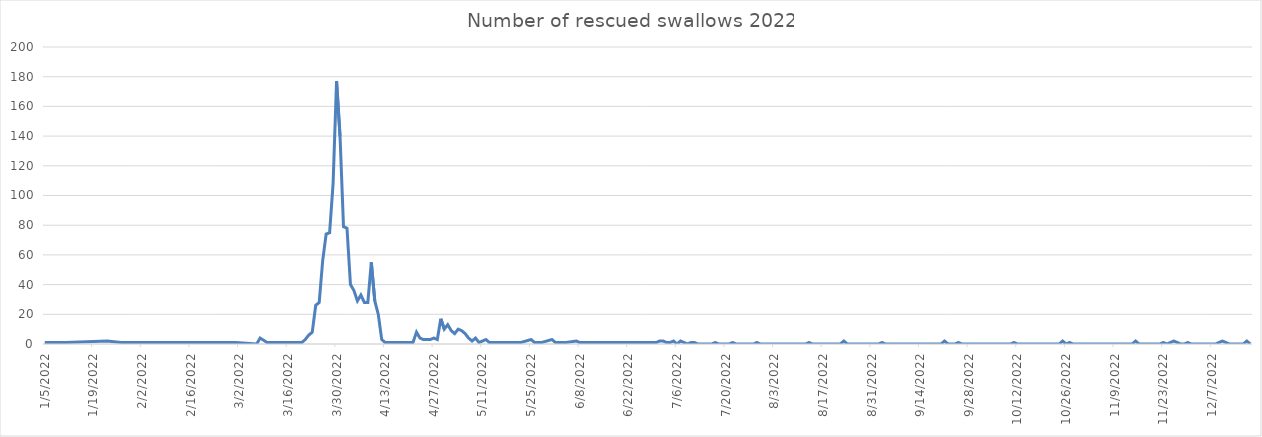
| Category | Series 0 |
|---|---|
| 1/5/22 | 1 |
| 1/11/22 | 1 |
| 1/23/22 | 2 |
| 1/27/22 | 1 |
| 2/1/22 | 1 |
| 2/27/22 | 1 |
| 3/1/22 | 1 |
| 3/7/22 | 0 |
| 3/8/22 | 4 |
| 3/10/22 | 1 |
| 3/17/22 | 1 |
| 3/18/22 | 1 |
| 3/19/22 | 1 |
| 3/20/22 | 1 |
| 3/21/22 | 3 |
| 3/22/22 | 6 |
| 3/23/22 | 8 |
| 3/24/22 | 26 |
| 3/25/22 | 28 |
| 3/26/22 | 56 |
| 3/27/22 | 74 |
| 3/28/22 | 75 |
| 3/29/22 | 108 |
| 3/30/22 | 177 |
| 3/31/22 | 140 |
| 4/1/22 | 79 |
| 4/2/22 | 78 |
| 4/3/22 | 40 |
| 4/4/22 | 36 |
| 4/5/22 | 29 |
| 4/6/22 | 33 |
| 4/7/22 | 28 |
| 4/8/22 | 28 |
| 4/9/22 | 55 |
| 4/10/22 | 29 |
| 4/11/22 | 20 |
| 4/12/22 | 3 |
| 4/13/22 | 1 |
| 4/14/22 | 1 |
| 4/16/22 | 1 |
| 4/17/22 | 1 |
| 4/18/22 | 1 |
| 4/21/22 | 1 |
| 4/22/22 | 8 |
| 4/23/22 | 4 |
| 4/24/22 | 3 |
| 4/25/22 | 3 |
| 4/26/22 | 3 |
| 4/27/22 | 4 |
| 4/28/22 | 3 |
| 4/29/22 | 17 |
| 4/30/22 | 10 |
| 5/1/22 | 13 |
| 5/2/22 | 9 |
| 5/3/22 | 7 |
| 5/4/22 | 10 |
| 5/5/22 | 9 |
| 5/6/22 | 7 |
| 5/7/22 | 4 |
| 5/8/22 | 2 |
| 5/9/22 | 4 |
| 5/10/22 | 1 |
| 5/12/22 | 3 |
| 5/13/22 | 1 |
| 5/18/22 | 1 |
| 5/21/22 | 1 |
| 5/22/22 | 1 |
| 5/25/22 | 3 |
| 5/26/22 | 1 |
| 5/27/22 | 1 |
| 5/28/22 | 1 |
| 5/31/22 | 3 |
| 6/1/22 | 1 |
| 6/4/22 | 1 |
| 6/7/22 | 2 |
| 6/8/22 | 1 |
| 6/23/22 | 1 |
| 6/25/22 | 1 |
| 6/29/22 | 1 |
| 6/30/22 | 1 |
| 7/1/22 | 2 |
| 7/2/22 | 2 |
| 7/3/22 | 1 |
| 7/4/22 | 1 |
| 7/5/22 | 2 |
| 7/6/22 | 0 |
| 7/7/22 | 2 |
| 7/8/22 | 1 |
| 7/9/22 | 0 |
| 7/10/22 | 1 |
| 7/11/22 | 1 |
| 7/12/22 | 0 |
| 7/13/22 | 0 |
| 7/14/22 | 0 |
| 7/15/22 | 0 |
| 7/16/22 | 0 |
| 7/17/22 | 1 |
| 7/18/22 | 0 |
| 7/19/22 | 0 |
| 7/20/22 | 0 |
| 7/21/22 | 0 |
| 7/22/22 | 1 |
| 7/23/22 | 0 |
| 7/24/22 | 0 |
| 7/25/22 | 0 |
| 7/26/22 | 0 |
| 7/27/22 | 0 |
| 7/28/22 | 0 |
| 7/29/22 | 1 |
| 7/30/22 | 0 |
| 7/31/22 | 0 |
| 8/1/22 | 0 |
| 8/2/22 | 0 |
| 8/3/22 | 0 |
| 8/4/22 | 0 |
| 8/5/22 | 0 |
| 8/6/22 | 0 |
| 8/7/22 | 0 |
| 8/8/22 | 0 |
| 8/9/22 | 0 |
| 8/10/22 | 0 |
| 8/11/22 | 0 |
| 8/12/22 | 0 |
| 8/13/22 | 1 |
| 8/14/22 | 0 |
| 8/15/22 | 0 |
| 8/16/22 | 0 |
| 8/17/22 | 0 |
| 8/18/22 | 0 |
| 8/19/22 | 0 |
| 8/20/22 | 0 |
| 8/21/22 | 0 |
| 8/22/22 | 0 |
| 8/23/22 | 2 |
| 8/24/22 | 0 |
| 8/25/22 | 0 |
| 8/26/22 | 0 |
| 8/27/22 | 0 |
| 8/28/22 | 0 |
| 8/29/22 | 0 |
| 8/30/22 | 0 |
| 8/31/22 | 0 |
| 9/1/22 | 0 |
| 9/2/22 | 0 |
| 9/3/22 | 1 |
| 9/4/22 | 0 |
| 9/5/22 | 0 |
| 9/6/22 | 0 |
| 9/7/22 | 0 |
| 9/8/22 | 0 |
| 9/9/22 | 0 |
| 9/10/22 | 0 |
| 9/11/22 | 0 |
| 9/12/22 | 0 |
| 9/13/22 | 0 |
| 9/14/22 | 0 |
| 9/15/22 | 0 |
| 9/16/22 | 0 |
| 9/17/22 | 0 |
| 9/18/22 | 0 |
| 9/19/22 | 0 |
| 9/20/22 | 0 |
| 9/21/22 | 2 |
| 9/22/22 | 0 |
| 9/23/22 | 0 |
| 9/24/22 | 0 |
| 9/25/22 | 1 |
| 9/26/22 | 0 |
| 9/27/22 | 0 |
| 9/28/22 | 0 |
| 9/29/22 | 0 |
| 9/30/22 | 0 |
| 10/1/22 | 0 |
| 10/2/22 | 0 |
| 10/3/22 | 0 |
| 10/4/22 | 0 |
| 10/5/22 | 0 |
| 10/6/22 | 0 |
| 10/7/22 | 0 |
| 10/8/22 | 0 |
| 10/9/22 | 0 |
| 10/10/22 | 0 |
| 10/11/22 | 1 |
| 10/12/22 | 0 |
| 10/13/22 | 0 |
| 10/14/22 | 0 |
| 10/15/22 | 0 |
| 10/16/22 | 0 |
| 10/17/22 | 0 |
| 10/18/22 | 0 |
| 10/19/22 | 0 |
| 10/20/22 | 0 |
| 10/21/22 | 0 |
| 10/22/22 | 0 |
| 10/23/22 | 0 |
| 10/24/22 | 0 |
| 10/25/22 | 2 |
| 10/26/22 | 0 |
| 10/27/22 | 1 |
| 10/28/22 | 0 |
| 10/29/22 | 0 |
| 10/30/22 | 0 |
| 10/31/22 | 0 |
| 11/1/22 | 0 |
| 11/2/22 | 0 |
| 11/3/22 | 0 |
| 11/4/22 | 0 |
| 11/5/22 | 0 |
| 11/6/22 | 0 |
| 11/7/22 | 0 |
| 11/8/22 | 0 |
| 11/9/22 | 0 |
| 11/10/22 | 0 |
| 11/11/22 | 0 |
| 11/12/22 | 0 |
| 11/13/22 | 0 |
| 11/14/22 | 0 |
| 11/15/22 | 2 |
| 11/16/22 | 0 |
| 11/17/22 | 0 |
| 11/18/22 | 0 |
| 11/19/22 | 0 |
| 11/20/22 | 0 |
| 11/21/22 | 0 |
| 11/22/22 | 0 |
| 11/23/22 | 1 |
| 11/24/22 | 0 |
| 11/25/22 | 1 |
| 11/26/22 | 2 |
| 11/27/22 | 1 |
| 11/28/22 | 0 |
| 11/29/22 | 0 |
| 11/30/22 | 1 |
| 12/1/22 | 0 |
| 12/2/22 | 0 |
| 12/3/22 | 0 |
| 12/4/22 | 0 |
| 12/5/22 | 0 |
| 12/6/22 | 0 |
| 12/7/22 | 0 |
| 12/8/22 | 0 |
| 12/9/22 | 1 |
| 12/10/22 | 2 |
| 12/11/22 | 1 |
| 12/12/22 | 0 |
| 12/13/22 | 0 |
| 12/14/22 | 0 |
| 12/15/22 | 0 |
| 12/16/22 | 0 |
| 12/17/22 | 2 |
| 12/18/22 | 0 |